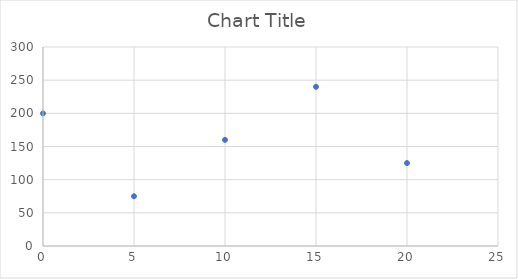
| Category | Series 0 |
|---|---|
| 5.0 | 75 |
| 20.0 | 125 |
| 10.0 | 160 |
| 15.0 | 240 |
| 0.0 | 200 |